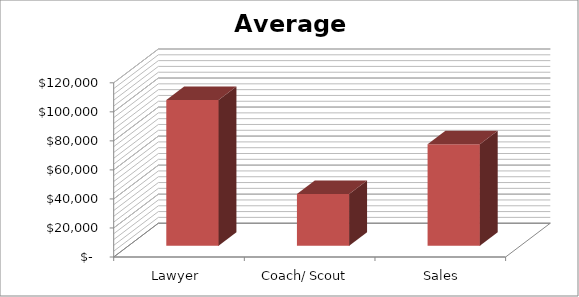
| Category | Average Salary  |
|---|---|
| Lawyer  | 100450 |
| Coach/ Scout  | 35580 |
| Sales Representitve  | 70000 |